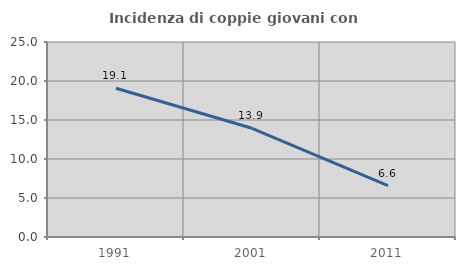
| Category | Incidenza di coppie giovani con figli |
|---|---|
| 1991.0 | 19.074 |
| 2001.0 | 13.934 |
| 2011.0 | 6.6 |